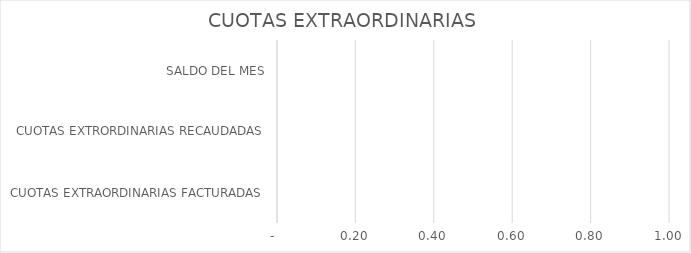
| Category | Series 0 |
|---|---|
| CUOTAS EXTRAORDINARIAS FACTURADAS | 0 |
| CUOTAS EXTRORDINARIAS RECAUDADAS | 0 |
| SALDO DEL MES | 0 |